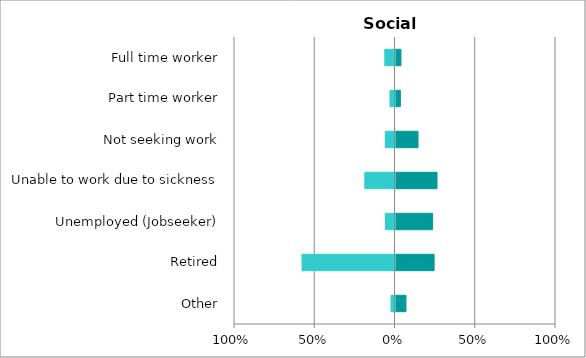
| Category | PRP | LA |
|---|---|---|
| Other | 0.065 | -0.023 |
| Retired | 0.241 | -0.578 |
| Unemployed (Jobseeker) | 0.231 | -0.06 |
| Unable to work due to sickness | 0.259 | -0.187 |
| Not seeking work | 0.14 | -0.06 |
| Part time worker | 0.03 | -0.03 |
| Full time worker | 0.034 | -0.062 |